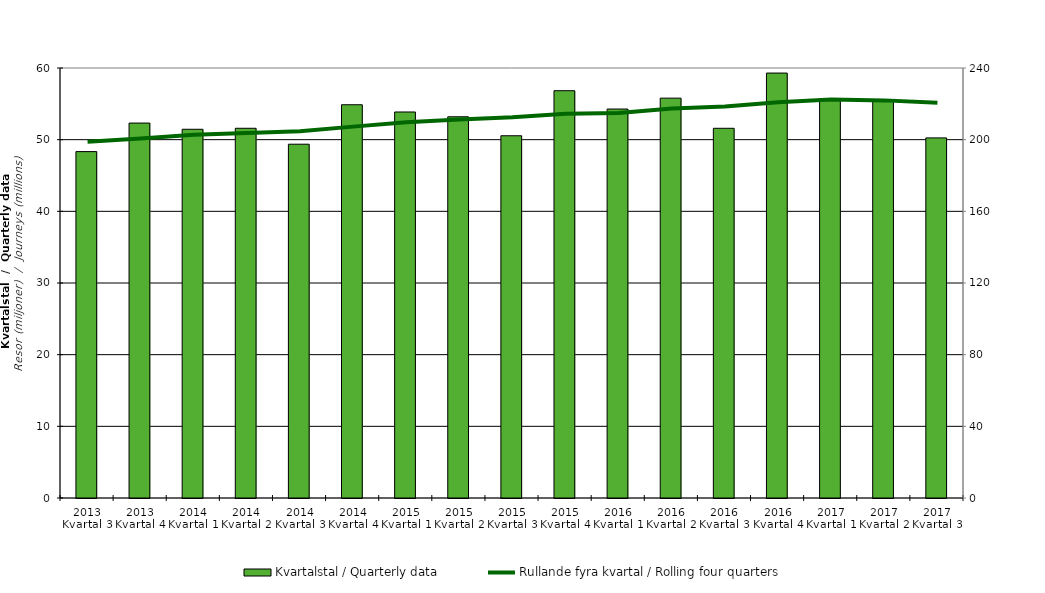
| Category | Kvartalstal / Quarterly data |
|---|---|
| 2013 Kvartal 3 | 48.335 |
| 2013 Kvartal 4 | 52.317 |
| 2014 Kvartal 1 | 51.451 |
| 2014 Kvartal 2 | 51.589 |
| 2014 Kvartal 3 | 49.366 |
| 2014 Kvartal 4 | 54.874 |
| 2015 Kvartal 1 | 53.862 |
| 2015 Kvartal 2 | 53.194 |
| 2015 Kvartal 3 | 50.546 |
| 2015 Kvartal 4 | 56.832 |
| 2016 Kvartal 1 | 54.273 |
| 2016 Kvartal 2 | 55.793 |
| 2016 Kvartal 3 | 51.587 |
| 2016 Kvartal 4 | 59.293 |
| 2017 Kvartal 1 | 55.689 |
| 2017 Kvartal 2 | 55.361 |
| 2017 Kvartal 3 | 50.246 |